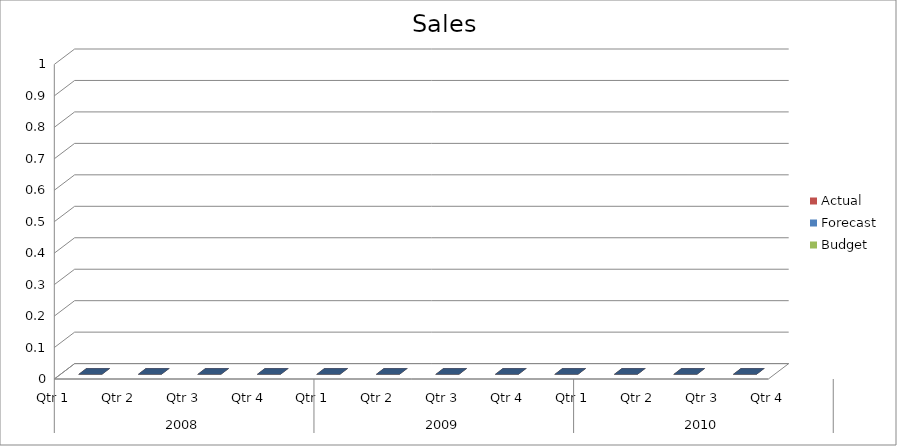
| Category | Budget | Forecast | Actual |
|---|---|---|---|
| 0 | 2890 | 1100 | 2180 |
| 1 | 3280 | 1790 | 1410 |
| 2 | 1610 | 950 | 2410 |
| 3 | 1860 | 2780 | 910 |
| 4 | 2570 | 2070 | 3360 |
| 5 | 880 | 1810 | 940 |
| 6 | 2180 | 2090 | 2830 |
| 7 | 2230 | 1480 | 2170 |
| 8 | 2930 | 1180 | 1730 |
| 9 | 930 | 2900 | 2610 |
| 10 | 2880 | 840 | 1140 |
| 11 | 1350 | 3360 | 3090 |